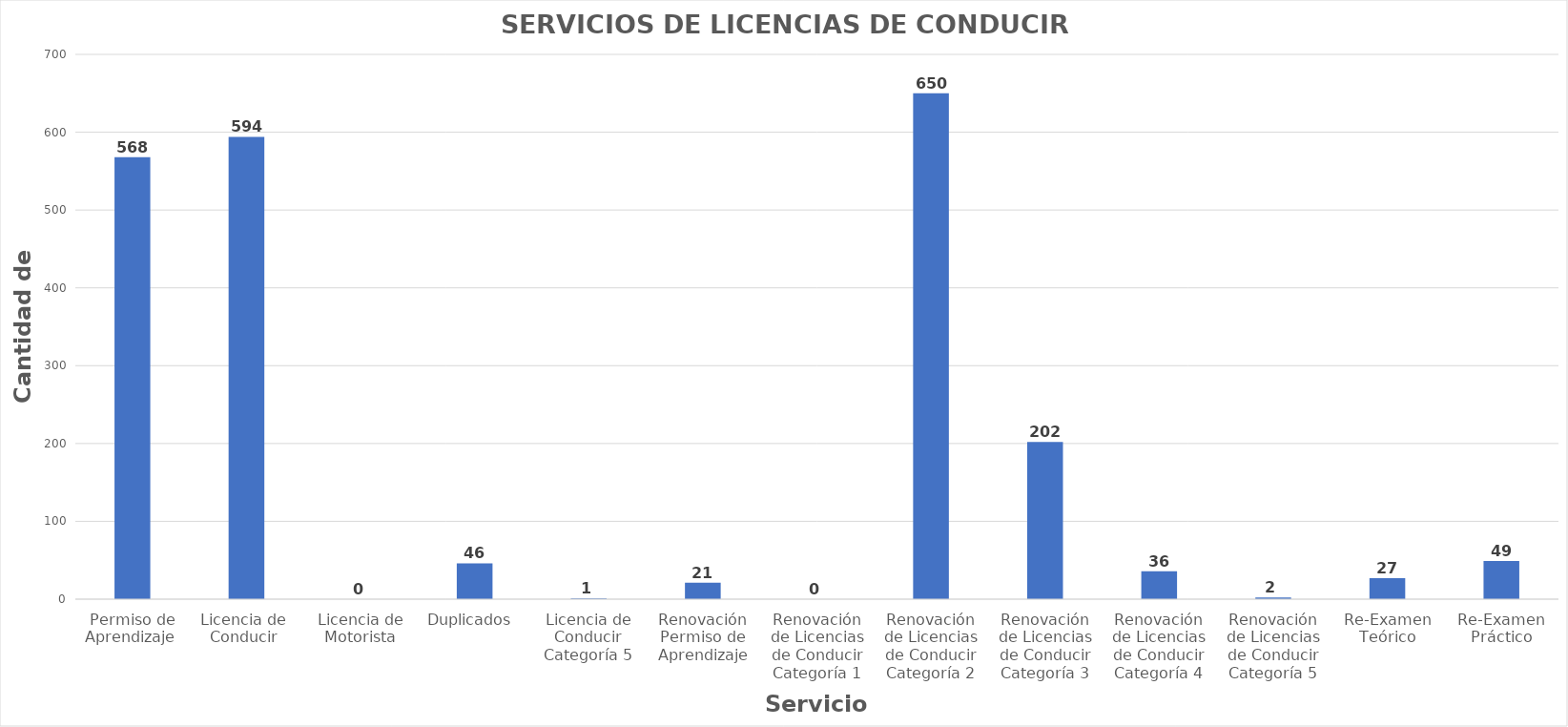
| Category | Series 0 |
|---|---|
| Permiso de Aprendizaje  | 568 |
| Licencia de  Conducir  | 594 |
| Licencia de Motorista | 0 |
| Duplicados  | 46 |
| Licencia de Conducir Categoría 5 | 1 |
| Renovación Permiso de Aprendizaje | 21 |
| Renovación de Licencias de Conducir Categoría 1 | 0 |
| Renovación de Licencias de Conducir Categoría 2 | 650 |
| Renovación de Licencias de Conducir Categoría 3 | 202 |
| Renovación de Licencias de Conducir Categoría 4 | 36 |
| Renovación de Licencias de Conducir Categoría 5 | 2 |
| Re-Examen Teórico | 27 |
| Re-Examen Práctico | 49 |